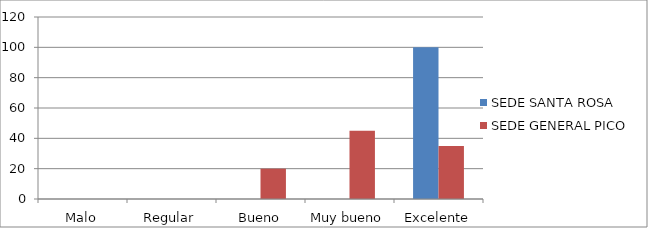
| Category | SEDE SANTA ROSA | SEDE GENERAL PICO |
|---|---|---|
| Malo | 0 | 0 |
| Regular | 0 | 0 |
| Bueno | 0 | 20 |
| Muy bueno | 0 | 45 |
| Excelente | 100 | 35 |